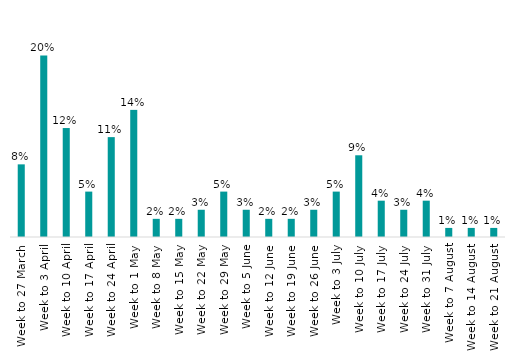
| Category | Series 0 |
|---|---|
| Week to 27 March | 0.08 |
| Week to 3 April | 0.2 |
| Week to 10 April | 0.12 |
| Week to 17 April | 0.05 |
| Week to 24 April | 0.11 |
| Week to 1 May | 0.14 |
| Week to 8 May | 0.02 |
| Week to 15 May | 0.02 |
| Week to 22 May | 0.03 |
| Week to 29 May | 0.05 |
| Week to 5 June | 0.03 |
| Week to 12 June | 0.02 |
| Week to 19 June | 0.02 |
| Week to 26 June | 0.03 |
| Week to 3 July | 0.05 |
| Week to 10 July | 0.09 |
| Week to 17 July | 0.04 |
| Week to 24 July | 0.03 |
| Week to 31 July | 0.04 |
| Week to 7 August | 0.01 |
| Week to 14 August | 0.01 |
| Week to 21 August | 0.01 |